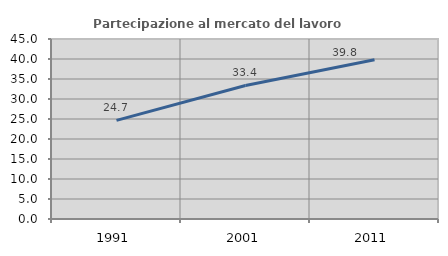
| Category | Partecipazione al mercato del lavoro  femminile |
|---|---|
| 1991.0 | 24.664 |
| 2001.0 | 33.386 |
| 2011.0 | 39.818 |